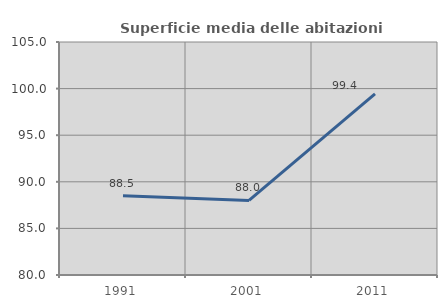
| Category | Superficie media delle abitazioni occupate |
|---|---|
| 1991.0 | 88.51 |
| 2001.0 | 88.004 |
| 2011.0 | 99.429 |